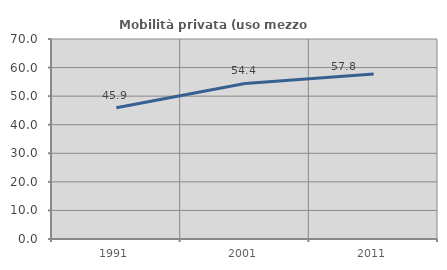
| Category | Mobilità privata (uso mezzo privato) |
|---|---|
| 1991.0 | 45.948 |
| 2001.0 | 54.426 |
| 2011.0 | 57.765 |